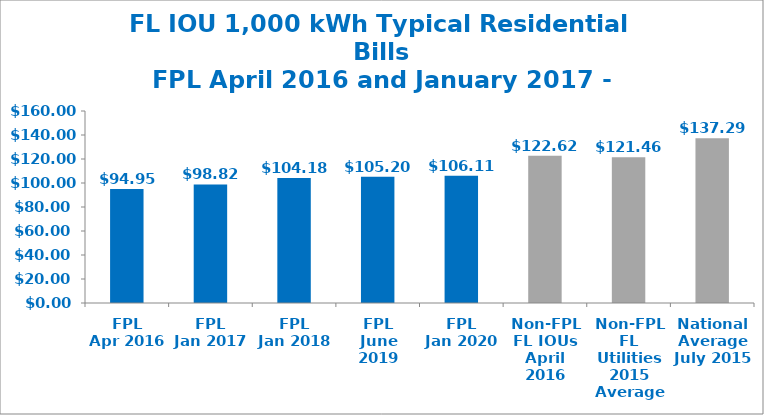
| Category | Series 0 |
|---|---|
| FPL
Apr 2016 | 94.95 |
| FPL
Jan 2017
 | 98.82 |
| FPL
Jan 2018 | 104.18 |
| FPL
June 2019 | 105.2 |
| FPL
Jan 2020 | 106.11 |
| Non-FPL FL IOUs
April 2016 | 122.62 |
| Non-FPL FL Utilities
2015 Average | 121.46 |
| National Average
July 2015 | 137.29 |